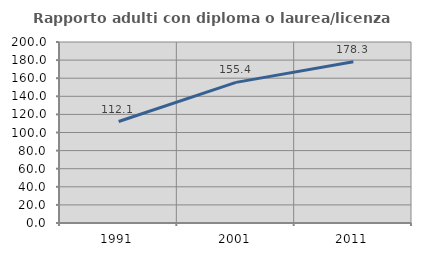
| Category | Rapporto adulti con diploma o laurea/licenza media  |
|---|---|
| 1991.0 | 112.141 |
| 2001.0 | 155.362 |
| 2011.0 | 178.286 |